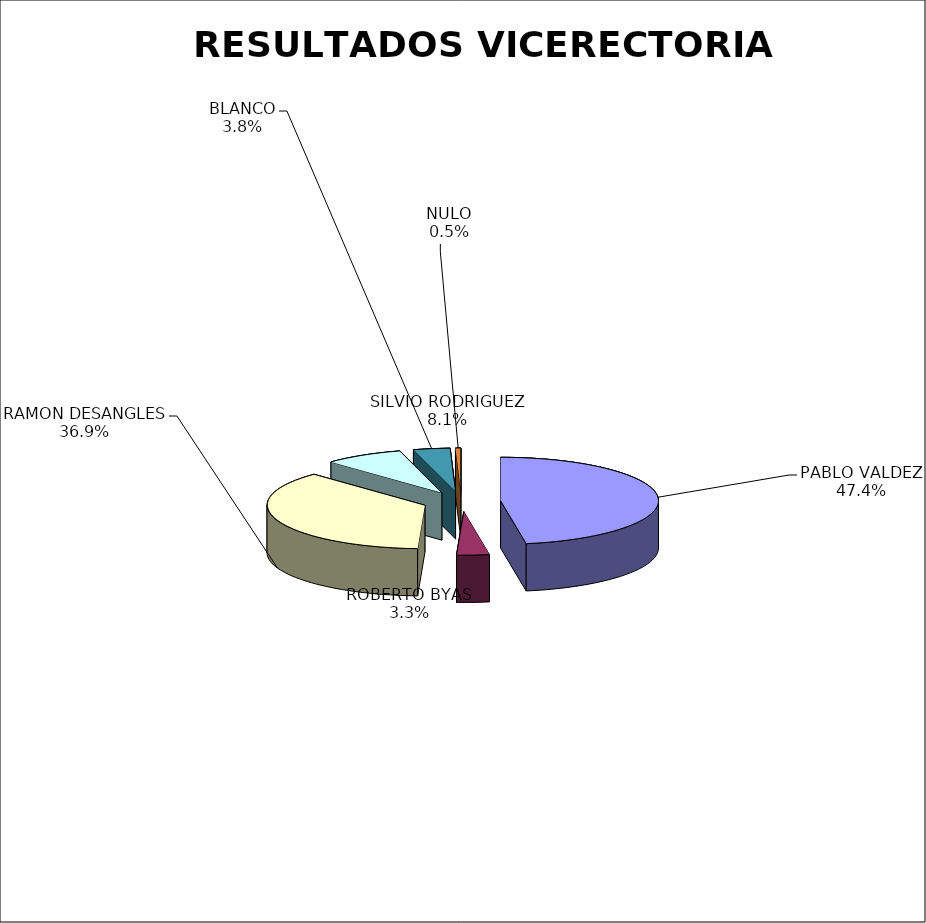
| Category | Series 0 |
|---|---|
| PABLO VALDEZ | 1224 |
| ROBERTO BYAS | 86 |
| RAMON DESANGLES | 952 |
| SILVIO RODRIGUEZ | 209 |
| BLANCO | 97 |
| NULO | 14 |